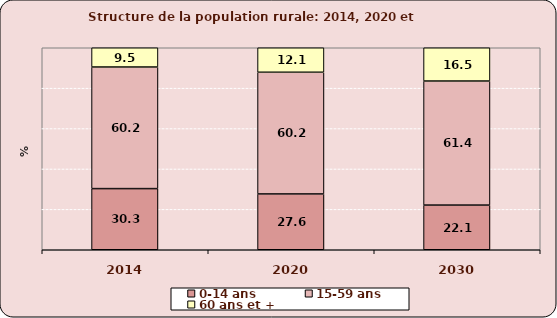
| Category | 0-14 ans  | 15-59 ans | 60 ans et + |
|---|---|---|---|
| 2014.0 | 30.272 | 60.194 | 9.534 |
| 2020.0 | 27.63 | 60.246 | 12.124 |
| 2030.0 | 22.114 | 61.415 | 16.472 |